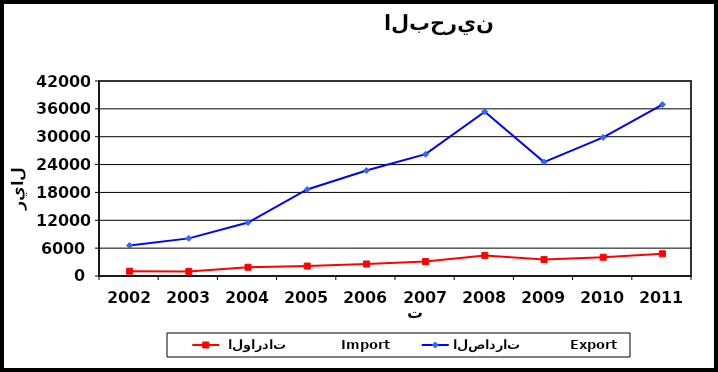
| Category |  الواردات           Import | الصادرات          Export |
|---|---|---|
| 2002.0 | 1032 | 6577 |
| 2003.0 | 988 | 8105 |
| 2004.0 | 1885 | 11507 |
| 2005.0 | 2146 | 18637 |
| 2006.0 | 2585 | 22717 |
| 2007.0 | 3116 | 26238 |
| 2008.0 | 4429 | 35389 |
| 2009.0 | 3530 | 24534 |
| 2010.0 | 4044 | 29849 |
| 2011.0 | 4780 | 36935 |